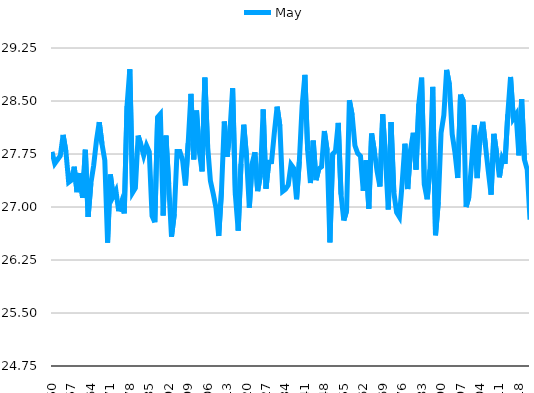
| Category | May |
|---|---|
| 1850 | 27.78 |
| 1851 | 27.615 |
| 1852 | 27.67 |
| 1853 | 27.725 |
| 1854 | 28.02 |
| 1855 | 27.785 |
| 1856 | 27.35 |
| 1857 | 27.38 |
| 1858 | 27.57 |
| 1859 | 27.21 |
| 1860 | 27.48 |
| 1861 | 27.13 |
| 1862 | 27.81 |
| 1863 | 26.86 |
| 1864 | 27.34 |
| 1865 | 27.59 |
| 1866 | 27.94 |
| 1867 | 28.2 |
| 1868 | 27.89 |
| 1869 | 27.66 |
| 1870 | 26.495 |
| 1871 | 27.46 |
| 1872 | 27.15 |
| 1873 | 27.23 |
| 1874 | 26.94 |
| 1875 | 27.065 |
| 1876 | 26.91 |
| 1877 | 28.43 |
| 1878 | 28.95 |
| 1879 | 27.205 |
| 1880 | 27.27 |
| 1881 | 28.01 |
| 1882 | 27.88 |
| 1883 | 27.73 |
| 1884 | 27.87 |
| 1885 | 27.78 |
| 1886 | 26.875 |
| 1887 | 26.785 |
| 1888 | 28.27 |
| 1889 | 28.315 |
| 1890 | 26.88 |
| 1891 | 28.01 |
| 1892 | 27.325 |
| 1893 | 26.58 |
| 1894 | 26.9 |
| 1895 | 27.785 |
| 1896 | 27.785 |
| 1897 | 27.66 |
| 1898 | 27.305 |
| 1899 | 27.905 |
| 1900 | 28.6 |
| 1901 | 27.675 |
| 1902 | 28.365 |
| 1903 | 27.79 |
| 1904 | 27.505 |
| 1905 | 28.83 |
| 1906 | 27.86 |
| 1907 | 27.37 |
| 1908 | 27.19 |
| 1909 | 26.99 |
| 1910 | 26.59 |
| 1911 | 27.24 |
| 1912 | 28.21 |
| 1913 | 27.71 |
| 1914 | 28.06 |
| 1915 | 28.68 |
| 1916 | 27.165 |
| 1917 | 26.665 |
| 1918 | 27.61 |
| 1919 | 28.165 |
| 1920 | 27.71 |
| 1921 | 26.99 |
| 1922 | 27.61 |
| 1923 | 27.775 |
| 1924 | 27.225 |
| 1925 | 27.45 |
| 1926 | 28.38 |
| 1927 | 27.26 |
| 1928 | 27.635 |
| 1929 | 27.64 |
| 1930 | 28.05 |
| 1931 | 28.42 |
| 1932 | 28.145 |
| 1933 | 27.22 |
| 1934 | 27.25 |
| 1935 | 27.31 |
| 1936 | 27.6 |
| 1937 | 27.545 |
| 1938 | 27.11 |
| 1939 | 27.645 |
| 1940 | 28.43 |
| 1941 | 28.87 |
| 1942 | 27.8 |
| 1943 | 27.34 |
| 1944 | 27.94 |
| 1945 | 27.38 |
| 1946 | 27.54 |
| 1947 | 27.57 |
| 1948 | 28.075 |
| 1949 | 27.8 |
| 1950 | 26.5 |
| 1951 | 27.75 |
| 1952 | 27.79 |
| 1953 | 28.19 |
| 1954 | 27.18 |
| 1955 | 26.81 |
| 1956 | 26.945 |
| 1957 | 28.51 |
| 1958 | 28.3 |
| 1959 | 27.87 |
| 1960 | 27.76 |
| 1961 | 27.72 |
| 1962 | 27.23 |
| 1963 | 27.66 |
| 1964 | 26.976 |
| 1965 | 28.04 |
| 1966 | 27.79 |
| 1967 | 27.5 |
| 1968 | 27.29 |
| 1969 | 28.31 |
| 1970 | 27.68 |
| 1971 | 26.965 |
| 1972 | 28.2 |
| 1973 | 27.21 |
| 1974 | 26.925 |
| 1975 | 26.86 |
| 1976 | 27.335 |
| 1977 | 27.895 |
| 1978 | 27.255 |
| 1979 | 27.805 |
| 1980 | 28.05 |
| 1981 | 27.53 |
| 1982 | 28.46 |
| 1983 | 28.83 |
| 1984 | 27.31 |
| 1985 | 27.11 |
| 1986 | 27.53 |
| 1987 | 28.7 |
| 1988 | 26.6 |
| 1989 | 27.07 |
| 1990 | 28.05 |
| 1991 | 28.3 |
| 1992 | 28.94 |
| 1993 | 28.73 |
| 1994 | 28.03 |
| 1995 | 27.77 |
| 1996 | 27.41 |
| 1997 | 28.59 |
| 1998 | 28.5 |
| 1999 | 27 |
| 2000 | 27.14 |
| 2001 | 27.63 |
| 2002 | 28.16 |
| 2003 | 27.41 |
| 2004 | 28.01 |
| 2005 | 28.205 |
| 2006 | 27.86 |
| 2007 | 27.507 |
| 2008 | 27.175 |
| 2009 | 28.035 |
| 2010 | 27.755 |
| 2011 | 27.42 |
| 2012 | 27.69 |
| 2013 | 27.61 |
| 2014 | 28.31 |
| 2015 | 28.84 |
| 2016 | 28.25 |
| 2017 | 28.31 |
| 2018 | 27.73 |
| 2019 | 28.525 |
| 2020 | 27.67 |
| 2021 | 27.53 |
| 2022 | 26.82 |